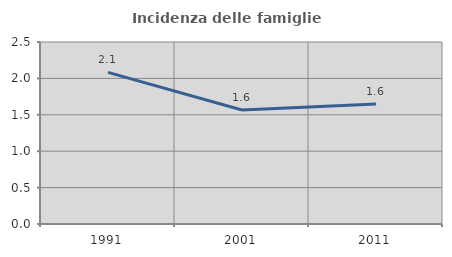
| Category | Incidenza delle famiglie numerose |
|---|---|
| 1991.0 | 2.083 |
| 2001.0 | 1.567 |
| 2011.0 | 1.648 |